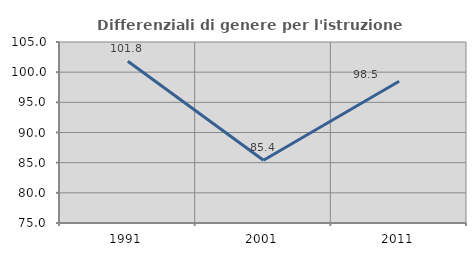
| Category | Differenziali di genere per l'istruzione superiore |
|---|---|
| 1991.0 | 101.818 |
| 2001.0 | 85.41 |
| 2011.0 | 98.485 |